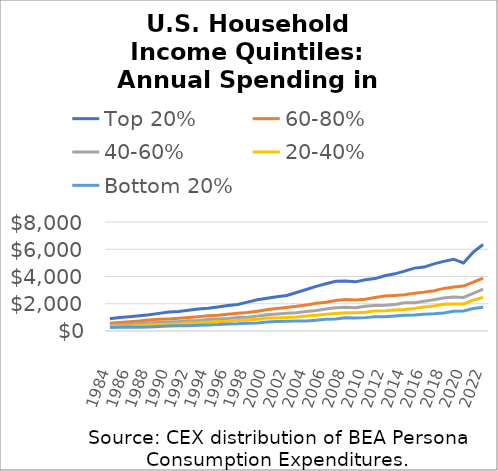
| Category | Top 20% | 60-80% | 40-60% | 20-40% | Bottom 20% |
|---|---|---|---|---|---|
| 1984-01-01 | 893.776 | 572.144 | 438.877 | 330.938 | 256.605 |
| 1985-01-01 | 988.311 | 620.724 | 470.462 | 358.006 | 275.327 |
| 1986-01-01 | 1052.441 | 670.747 | 508.445 | 363.944 | 290.702 |
| 1987-01-01 | 1111.645 | 726.678 | 549.424 | 410.723 | 277.809 |
| 1988-01-01 | 1186.698 | 801.301 | 598.282 | 447.926 | 295.806 |
| 1989-01-01 | 1293.365 | 858.385 | 628.494 | 467.628 | 328.886 |
| 1990-01-01 | 1401.486 | 887.599 | 658.981 | 495.502 | 365.426 |
| 1991-01-01 | 1428.859 | 927.473 | 689.33 | 519.704 | 378.083 |
| 1992-01-01 | 1526.347 | 984.478 | 749.274 | 560.966 | 376.495 |
| 1993-01-01 | 1612.366 | 1045.646 | 771.943 | 592.614 | 429.415 |
| 1994-01-01 | 1676.202 | 1117.055 | 840.354 | 638.603 | 448.751 |
| 1995-01-01 | 1765.056 | 1153.037 | 880.148 | 694.886 | 469.462 |
| 1996-01-01 | 1868.443 | 1227.532 | 921.121 | 716.814 | 510.685 |
| 1997-01-01 | 1945.569 | 1300.817 | 987.858 | 768.628 | 533.917 |
| 1998-01-01 | 2121.586 | 1363.471 | 1017.573 | 801.124 | 573.493 |
| 1999-01-01 | 2291.747 | 1457.313 | 1091.315 | 854.472 | 588.911 |
| 2000-01-01 | 2400.072 | 1557.989 | 1199.161 | 951.647 | 658.311 |
| 2001-01-01 | 2506.921 | 1654.255 | 1247.374 | 960.245 | 705.006 |
| 2002-01-01 | 2609.507 | 1728.59 | 1302.475 | 991.869 | 716.499 |
| 2003-01-01 | 2823.467 | 1809.148 | 1345.189 | 1030.473 | 732.473 |
| 2004-01-01 | 3043.254 | 1914.925 | 1433.33 | 1099.967 | 740.483 |
| 2005-01-01 | 3272.232 | 2036.997 | 1510.42 | 1158.37 | 791.048 |
| 2006-01-01 | 3464.291 | 2113.977 | 1620.872 | 1224.219 | 853.878 |
| 2007-01-01 | 3646.28 | 2235.052 | 1705.345 | 1285.215 | 874.702 |
| 2008-01-01 | 3676.426 | 2320.181 | 1741.437 | 1339.83 | 972.21 |
| 2009-01-01 | 3607.053 | 2279.157 | 1706.066 | 1344.302 | 954.64 |
| 2010-01-01 | 3755.198 | 2338.086 | 1809.058 | 1376.217 | 981.698 |
| 2011-01-01 | 3848.182 | 2465.427 | 1876.828 | 1469.123 | 1039.297 |
| 2012-01-01 | 4053.101 | 2568.219 | 1894.751 | 1490.383 | 1040.91 |
| 2013-01-01 | 4194.86 | 2610.168 | 1946.882 | 1543.252 | 1093.071 |
| 2014-01-01 | 4393.335 | 2667.558 | 2076.513 | 1586.411 | 1150.633 |
| 2015-01-01 | 4614.12 | 2779.163 | 2075.381 | 1648.185 | 1180.59 |
| 2016-01-01 | 4693.017 | 2853.152 | 2187.394 | 1762.135 | 1231.151 |
| 2017-01-01 | 4930.382 | 2961.456 | 2298.236 | 1837.549 | 1263.003 |
| 2018-01-01 | 5109.651 | 3126.924 | 2414.421 | 1958.383 | 1325.064 |
| 2019-01-01 | 5268.767 | 3227.361 | 2495.894 | 1982.561 | 1443.03 |
| 2020-01-01 | 4992.896 | 3299.652 | 2460.341 | 1981.009 | 1472.333 |
| 2021-01-01 | 5784.573 | 3579.367 | 2765.371 | 2268.88 | 1644.772 |
| 2022-01-01 | 6347.031 | 3879.171 | 3079.037 | 2466.616 | 1739.89 |